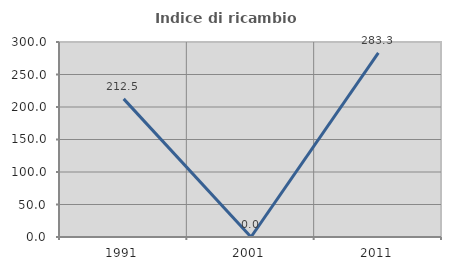
| Category | Indice di ricambio occupazionale  |
|---|---|
| 1991.0 | 212.5 |
| 2001.0 | 0 |
| 2011.0 | 283.333 |